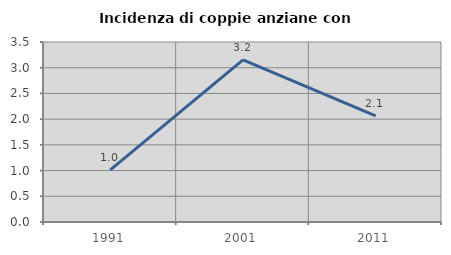
| Category | Incidenza di coppie anziane con figli |
|---|---|
| 1991.0 | 1.015 |
| 2001.0 | 3.151 |
| 2011.0 | 2.062 |